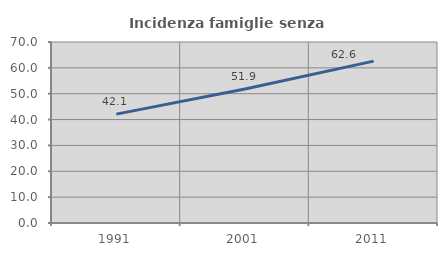
| Category | Incidenza famiglie senza nuclei |
|---|---|
| 1991.0 | 42.105 |
| 2001.0 | 51.852 |
| 2011.0 | 62.609 |